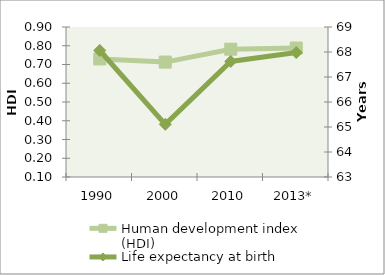
| Category | Human development index (HDI) |
|---|---|
| 1990 | 0.73 |
| 2000 | 0.713 |
| 2010 | 0.782 |
| 2013* | 0.788 |